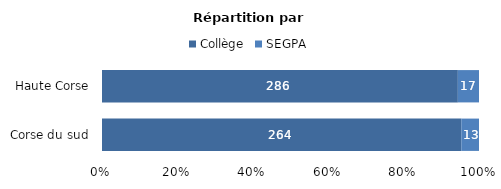
| Category | Collège | SEGPA |
|---|---|---|
| Corse du sud | 264 | 13 |
| Haute Corse | 286 | 17 |